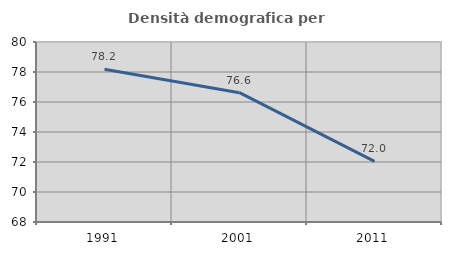
| Category | Densità demografica |
|---|---|
| 1991.0 | 78.18 |
| 2001.0 | 76.621 |
| 2011.0 | 72.037 |